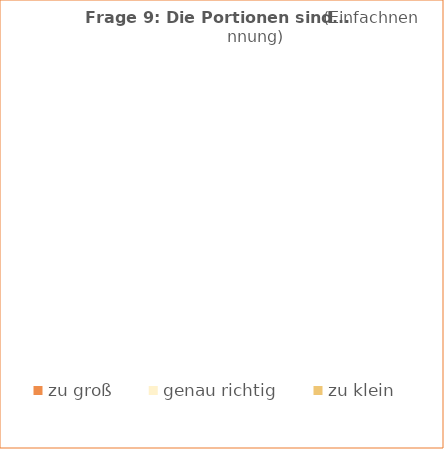
| Category | Series 0 | Series 1 |
|---|---|---|
| zu groß |  | 0 |
| genau richtig |  | 0 |
| zu klein |  | 0 |